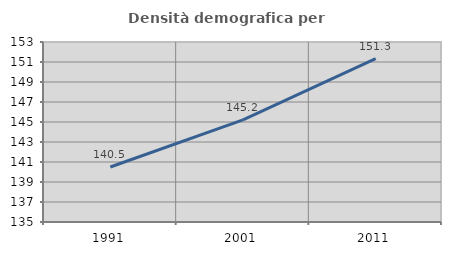
| Category | Densità demografica |
|---|---|
| 1991.0 | 140.5 |
| 2001.0 | 145.217 |
| 2011.0 | 151.339 |